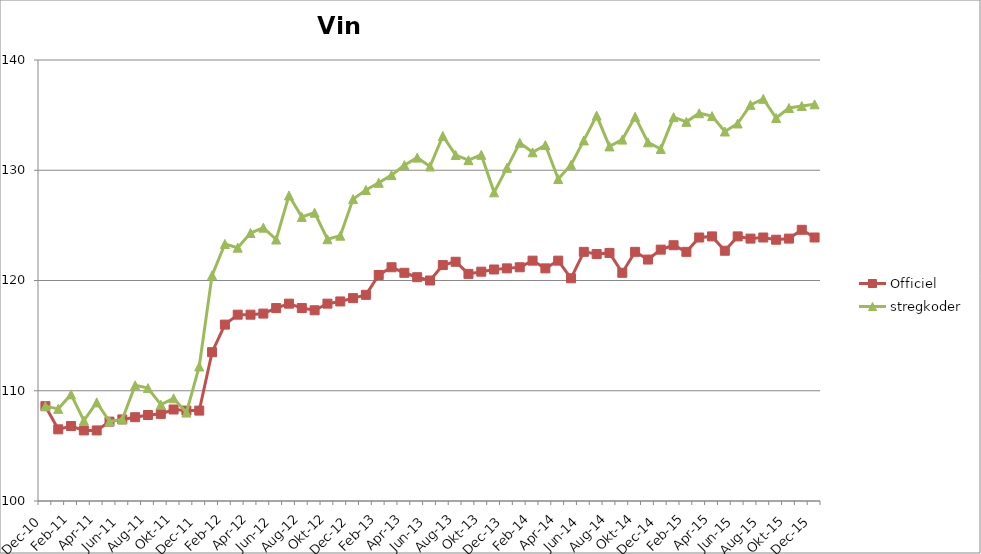
| Category | Officiel | stregkoder |
|---|---|---|
|  Dec-10 | 108.6 | 108.607 |
|  Jan-11 | 106.5 | 108.358 |
|  Feb-11 | 106.8 | 109.67 |
|  Mar-11 | 106.4 | 107.294 |
|  Apr-11 | 106.4 | 108.944 |
|  Maj-11 | 107.2 | 107.214 |
|  Jun-11 | 107.4 | 107.404 |
|  Jul-11 | 107.6 | 110.493 |
|  Aug-11 | 107.8 | 110.239 |
|  Sep-11 | 107.9 | 108.738 |
|  Okt-11 | 108.3 | 109.315 |
|  Nov-11 | 108.2 | 108.02 |
|  Dec-11 | 108.2 | 112.203 |
|  Jan-12 | 113.5 | 120.47 |
|  Feb-12 | 116 | 123.314 |
|  Mar-12 | 116.9 | 122.975 |
|  Apr-12 | 116.9 | 124.308 |
|  Maj-12 | 117 | 124.795 |
|  Jun-12 | 117.5 | 123.718 |
|  Jul-12 | 117.9 | 127.716 |
|  Aug-12 | 117.5 | 125.763 |
|  Sep-12 | 117.3 | 126.15 |
|  Okt-12 | 117.9 | 123.742 |
|  Nov-12 | 118.1 | 124.062 |
|  Dec-12 | 118.4 | 127.383 |
|  Jan-13 | 118.7 | 128.209 |
|  Feb-13 | 120.5 | 128.862 |
|  Mar-13 | 121.2 | 129.557 |
|  Apr-13 | 120.7 | 130.464 |
|  Maj-13 | 120.3 | 131.146 |
|  Jun-13 | 120 | 130.34 |
|  Jul-13 | 121.4 | 133.108 |
|  Aug-13 | 121.7 | 131.382 |
|  Sep-13 | 120.6 | 130.913 |
|  Okt-13 | 120.8 | 131.397 |
|  Nov-13 | 121 | 127.995 |
|  Dec-13 | 121.1 | 130.22 |
|  Jan-14 | 121.2 | 132.493 |
|  Feb-14 | 121.8 | 131.627 |
|  Mar-14 | 121.1 | 132.282 |
|  Apr-14 | 121.8 | 129.205 |
|  Maj-14 | 120.2 | 130.488 |
|  Jun-14 | 122.6 | 132.706 |
|  Jul-14 | 122.4 | 134.955 |
|  Aug-14 | 122.5 | 132.163 |
|  Sep-14 | 120.7 | 132.78 |
|  Okt-14 | 122.6 | 134.856 |
|  Nov-14 | 121.9 | 132.534 |
|  Dec-14 | 122.8 | 131.925 |
|  Jan-15 | 123.2 | 134.814 |
|  Feb-15 | 122.6 | 134.392 |
|  Mar-15 | 123.9 | 135.173 |
|  Apr-15 | 124 | 134.91 |
|  Maj-15 | 122.7 | 133.515 |
| Jun-15 | 124 | 134.241 |
| Jul-15 | 123.8 | 135.931 |
| Aug-15 | 123.9 | 136.475 |
| Sep-15 | 123.7 | 134.738 |
| Okt-15 | 123.8 | 135.647 |
| Nov-15 | 124.6 | 135.829 |
| Dec-15 | 123.901 | 135.98 |